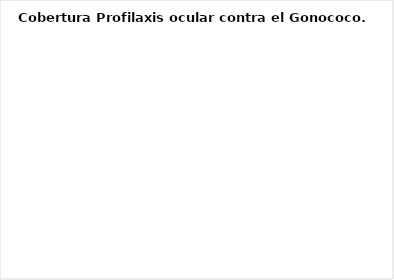
| Category | Series 0 |
|---|---|
| Con profilaxis | 0 |
| Sin profilaxis | 0 |